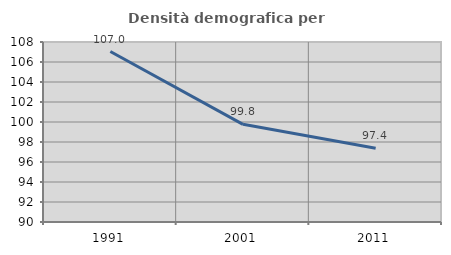
| Category | Densità demografica |
|---|---|
| 1991.0 | 107.045 |
| 2001.0 | 99.765 |
| 2011.0 | 97.377 |